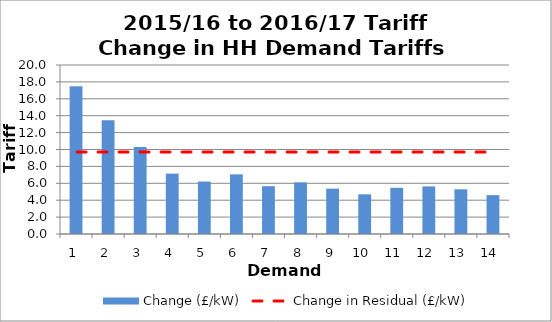
| Category | Change (£/kW) |
|---|---|
| 1.0 | 17.497 |
| 2.0 | 13.455 |
| 3.0 | 10.31 |
| 4.0 | 7.145 |
| 5.0 | 6.206 |
| 6.0 | 7.058 |
| 7.0 | 5.658 |
| 8.0 | 6.109 |
| 9.0 | 5.367 |
| 10.0 | 4.698 |
| 11.0 | 5.466 |
| 12.0 | 5.633 |
| 13.0 | 5.291 |
| 14.0 | 4.601 |